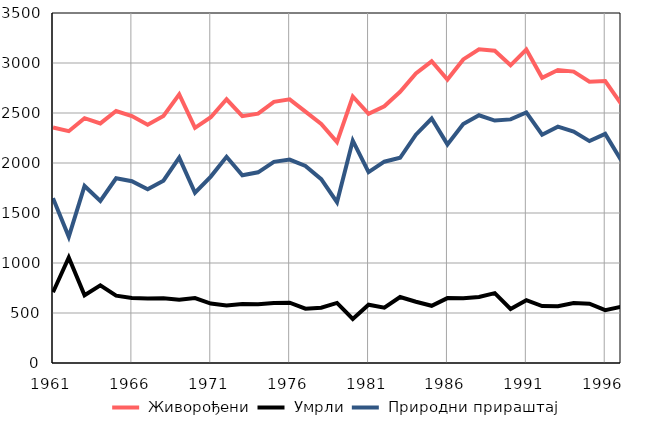
| Category |  Живорођени |  Умрли |  Природни прираштај |
|---|---|---|---|
| 1961.0 | 2355 | 707 | 1648 |
| 1962.0 | 2318 | 1056 | 1262 |
| 1963.0 | 2448 | 678 | 1770 |
| 1964.0 | 2396 | 776 | 1620 |
| 1965.0 | 2520 | 673 | 1847 |
| 1966.0 | 2469 | 651 | 1818 |
| 1967.0 | 2382 | 645 | 1737 |
| 1968.0 | 2470 | 647 | 1823 |
| 1969.0 | 2687 | 633 | 2054 |
| 1970.0 | 2352 | 649 | 1703 |
| 1971.0 | 2458 | 594 | 1864 |
| 1972.0 | 2637 | 575 | 2062 |
| 1973.0 | 2468 | 591 | 1877 |
| 1974.0 | 2494 | 587 | 1907 |
| 1975.0 | 2611 | 599 | 2012 |
| 1976.0 | 2637 | 603 | 2034 |
| 1977.0 | 2514 | 543 | 1971 |
| 1978.0 | 2391 | 553 | 1838 |
| 1979.0 | 2209 | 601 | 1608 |
| 1980.0 | 2665 | 441 | 2224 |
| 1981.0 | 2491 | 583 | 1908 |
| 1982.0 | 2567 | 554 | 2013 |
| 1983.0 | 2712 | 660 | 2052 |
| 1984.0 | 2896 | 613 | 2283 |
| 1985.0 | 3017 | 572 | 2445 |
| 1986.0 | 2835 | 649 | 2186 |
| 1987.0 | 3036 | 647 | 2389 |
| 1988.0 | 3138 | 661 | 2477 |
| 1989.0 | 3123 | 699 | 2424 |
| 1990.0 | 2977 | 541 | 2436 |
| 1991.0 | 3134 | 628 | 2506 |
| 1992.0 | 2852 | 569 | 2283 |
| 1993.0 | 2930 | 567 | 2363 |
| 1994.0 | 2914 | 600 | 2314 |
| 1995.0 | 2812 | 593 | 2219 |
| 1996.0 | 2819 | 528 | 2291 |
| 1997.0 | 2593 | 562 | 2031 |